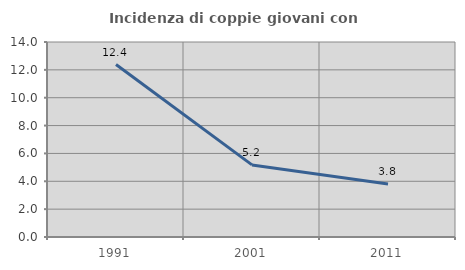
| Category | Incidenza di coppie giovani con figli |
|---|---|
| 1991.0 | 12.381 |
| 2001.0 | 5.176 |
| 2011.0 | 3.812 |